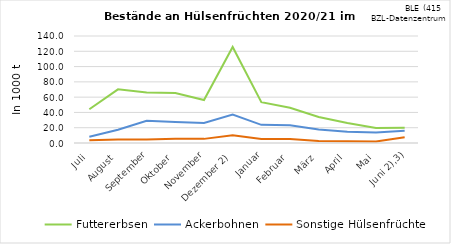
| Category | Futtererbsen | Ackerbohnen | Sonstige Hülsenfrüchte |
|---|---|---|---|
| Juli | 44.193 | 8.106 | 3.508 |
| August | 70.173 | 17.288 | 4.5 |
| September | 66.157 | 28.952 | 4.634 |
| Oktober | 65.311 | 27.589 | 5.415 |
| November | 56.221 | 26.203 | 5.402 |
|  Dezember 2) | 125.646 | 37.075 | 10.26 |
| Januar | 53.347 | 23.783 | 5.227 |
| Februar | 46.052 | 23.124 | 5.238 |
| März | 34.058 | 17.742 | 2.665 |
| April | 26.202 | 14.876 | 2.246 |
| Mai | 19.612 | 13.699 | 2.098 |
|    Juni 2),3) | 19.808 | 16.174 | 7.583 |